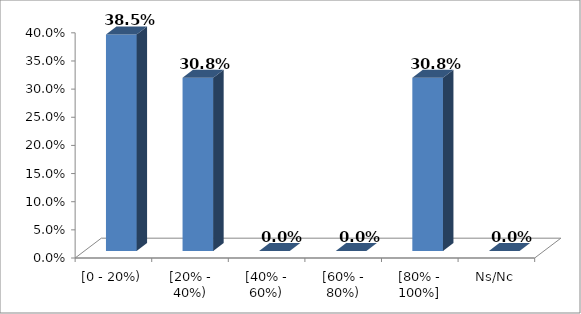
| Category | % |
|---|---|
| [0 - 20%) | 0.385 |
| [20% - 40%) | 0.308 |
| [40% - 60%) | 0 |
| [60% - 80%) | 0 |
| [80% - 100%] | 0.308 |
| Ns/Nc | 0 |